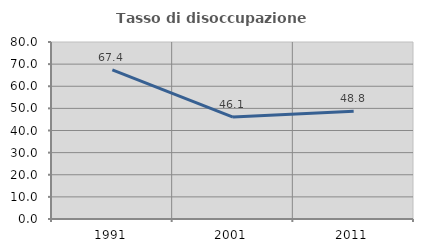
| Category | Tasso di disoccupazione giovanile  |
|---|---|
| 1991.0 | 67.368 |
| 2001.0 | 46.067 |
| 2011.0 | 48.75 |